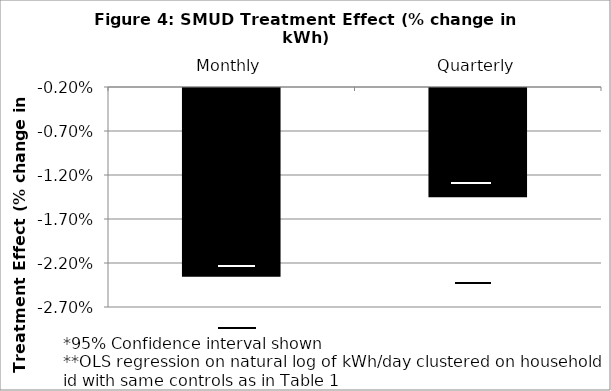
| Category | Series 0 |
|---|---|
| Monthly | -0.023 |
| Quarterly | -0.014 |